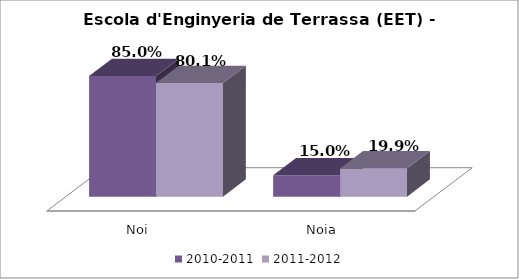
| Category | 2010-2011 | 2011-2012 |
|---|---|---|
| Noi | 0.85 | 0.801 |
| Noia | 0.15 | 0.199 |